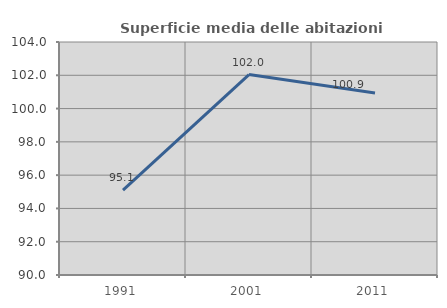
| Category | Superficie media delle abitazioni occupate |
|---|---|
| 1991.0 | 95.097 |
| 2001.0 | 102.045 |
| 2011.0 | 100.94 |